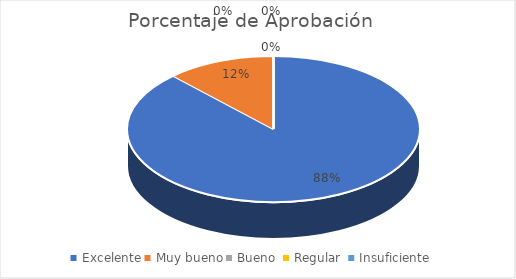
| Category | Porcentaje de Aprobación  |
|---|---|
| Excelente | 0.88 |
| Muy bueno | 0.12 |
| Bueno  | 0 |
| Regular  | 0 |
| Insuficiente | 0 |